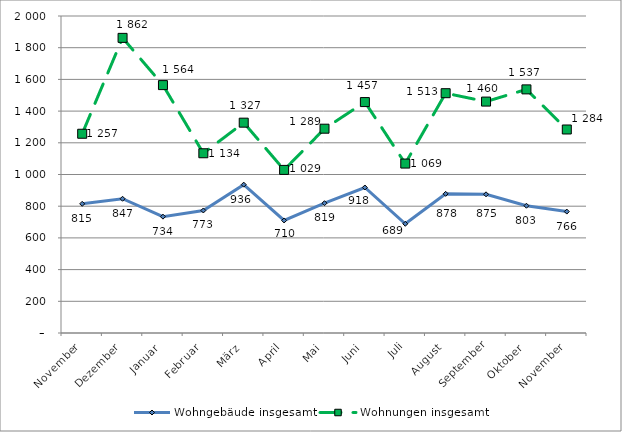
| Category | Wohngebäude insgesamt | Wohnungen insgesamt |
|---|---|---|
| November | 815 | 1257 |
| Dezember | 847 | 1862 |
| Januar | 734 | 1564 |
| Februar | 773 | 1134 |
| März | 936 | 1327 |
| April | 710 | 1029 |
| Mai | 819 | 1289 |
| Juni | 918 | 1457 |
| Juli | 689 | 1069 |
| August | 878 | 1513 |
| September | 875 | 1460 |
| Oktober | 803 | 1537 |
| November | 766 | 1284 |